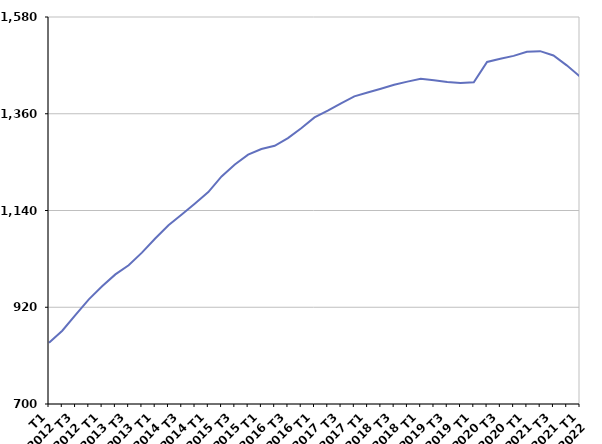
| Category | 50 ans ou plus |
|---|---|
| T1
2012 | 839.4 |
| T2
2012 | 866.6 |
| T3
2012 | 902.8 |
| T4
2012 | 938 |
| T1
2013 | 967.6 |
| T2
2013 | 994.7 |
| T3
2013 | 1015.6 |
| T4
2013 | 1044.2 |
| T1
2014 | 1076.2 |
| T2
2014 | 1106.4 |
| T3
2014 | 1130.8 |
| T4
2014 | 1155.9 |
| T1
2015 | 1181.8 |
| T2
2015 | 1217.4 |
| T3
2015 | 1244.5 |
| T4
2015 | 1267 |
| T1
2016 | 1279.9 |
| T2
2016 | 1287.1 |
| T3
2016 | 1304.5 |
| T4
2016 | 1327.1 |
| T1
2017 | 1351.7 |
| T2
2017 | 1366.9 |
| T3
2017 | 1383.8 |
| T4
2017 | 1399.6 |
| T1
2018 | 1408.3 |
| T2
2018 | 1416.9 |
| T3
2018 | 1425.8 |
| T4
2018 | 1433 |
| T1
2019 | 1439.4 |
| T2
2019 | 1436.4 |
| T3
2019 | 1432 |
| T4
2019 | 1429.9 |
| T1
2020 | 1431.4 |
| T2
2020 | 1477.7 |
| T3
2020 | 1485.1 |
| T4
2020 | 1491.6 |
| T1
2021 | 1500.8 |
| T2
2021 | 1502.3 |
| T3
2021 | 1492.4 |
| T4
2021 | 1470.1 |
| T1
2022 | 1444.6 |